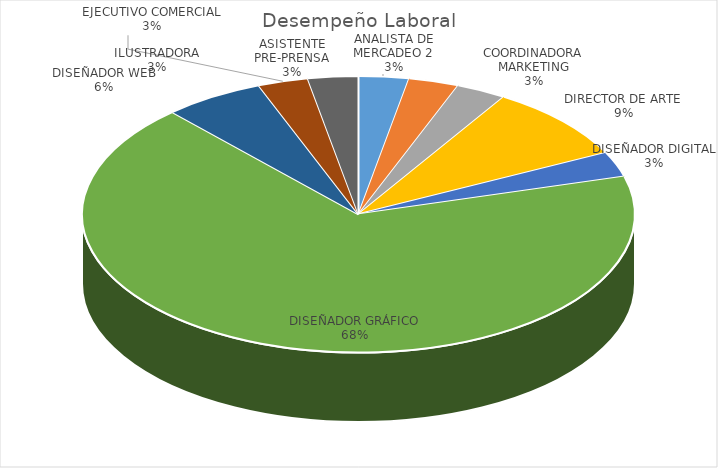
| Category | Total |
|---|---|
| ANALISTA DE MERCADEO 2 | 1 |
| ASISTENTE PRE-PRENSA | 1 |
| COORDINADORA MARKETING | 1 |
| DIRECTOR DE ARTE | 3 |
| DISEÑADOR DIGITAL | 1 |
| DISEÑADOR GRÁFICO | 23 |
| DISEÑADOR WEB | 2 |
| EJECUTIVO COMERCIAL | 1 |
| ILUSTRADORA | 1 |